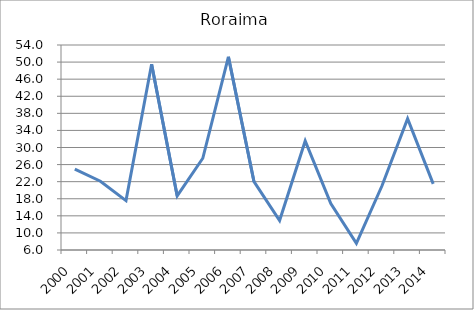
| Category | Roraima |
|---|---|
| 2000.0 | 24.956 |
| 2001.0 | 22.1 |
| 2002.0 | 17.563 |
| 2003.0 | 49.512 |
| 2004.0 | 18.655 |
| 2005.0 | 27.484 |
| 2006.0 | 51.235 |
| 2007.0 | 21.997 |
| 2008.0 | 12.892 |
| 2009.0 | 31.538 |
| 2010.0 | 16.855 |
| 2011.0 | 7.571 |
| 2012.0 | 21.044 |
| 2013.0 | 36.731 |
| 2014.0 | 21.484 |